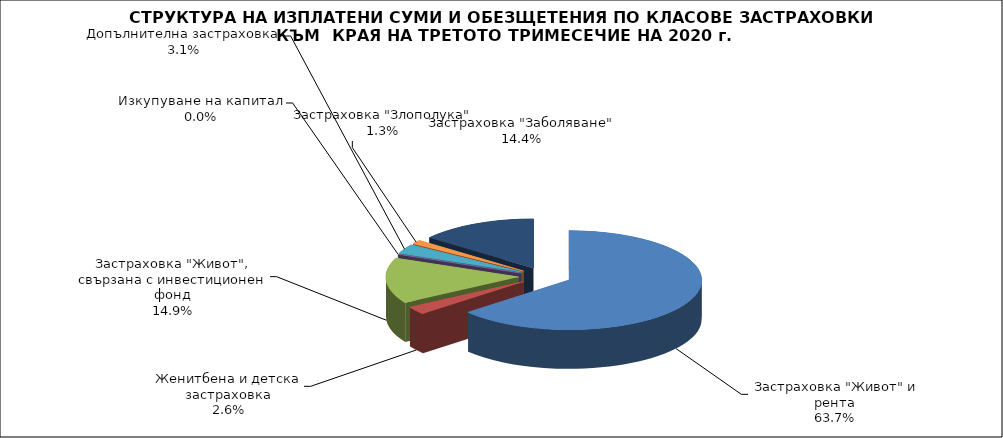
| Category | Series 0 |
|---|---|
|  Застраховка "Живот" и рента | 126037224.904 |
| Женитбена и детска застраховка | 5207192.447 |
| Застраховка "Живот", свързана с инвестиционен фонд | 29484663.676 |
| Изкупуване на капитал | 0 |
| Допълнителна застраховка | 6109260.905 |
| Застраховка "Злополука" | 2619216.122 |
| Застраховка "Заболяване" | 28412685.423 |